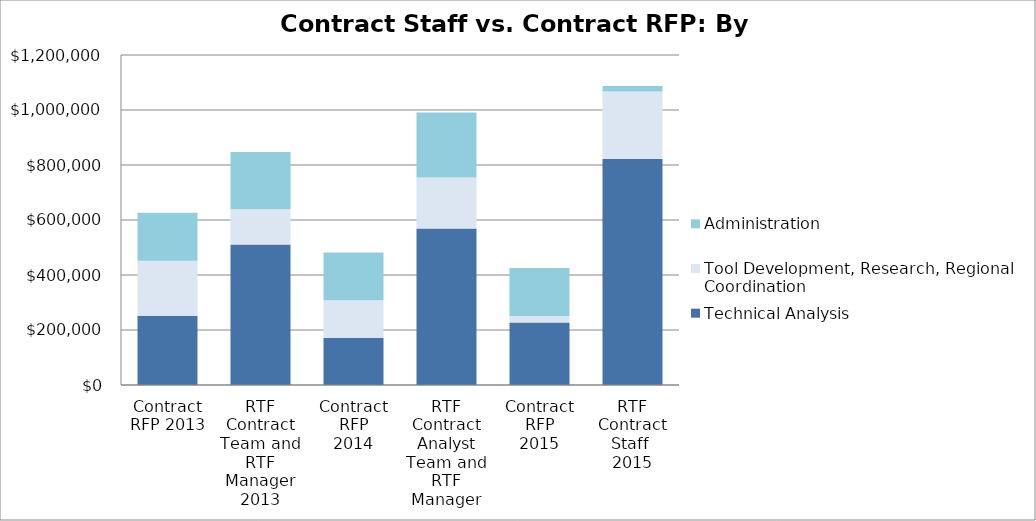
| Category | Technical Analysis | Tool Development, Research, Regional Coordination  | Administration |
|---|---|---|---|
| Contract RFP 2013 | 251883 | 200328 | 173814 |
| RTF Contract Team and RTF Manager
2013 | 511229.2 | 127561.8 | 208184 |
| Contract RFP
2014 | 170500 | 137500 | 174000 |
| RTF Contract Analyst Team and RTF Manager | 569000 | 186000 | 236000 |
| Contract RFP
2015 | 227500 | 23000 | 175100 |
| RTF Contract Staff 
2015 | 822000 | 245000 | 20000 |